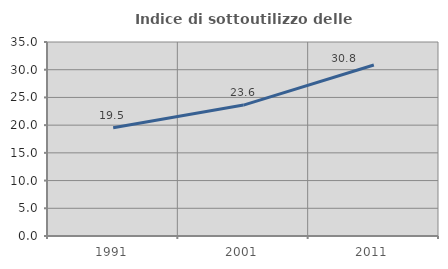
| Category | Indice di sottoutilizzo delle abitazioni  |
|---|---|
| 1991.0 | 19.513 |
| 2001.0 | 23.623 |
| 2011.0 | 30.849 |